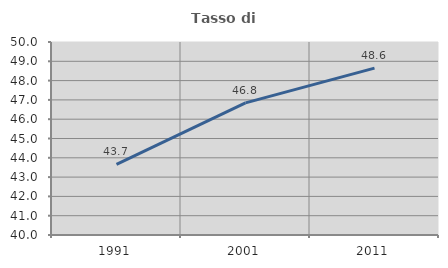
| Category | Tasso di occupazione   |
|---|---|
| 1991.0 | 43.658 |
| 2001.0 | 46.843 |
| 2011.0 | 48.647 |